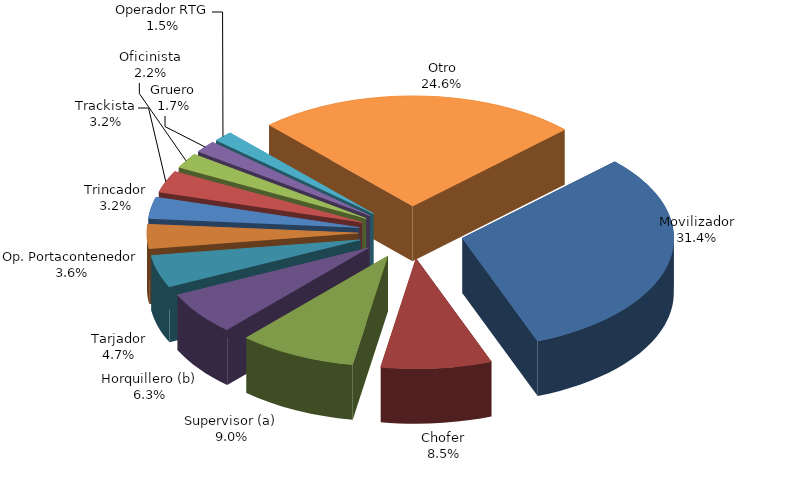
| Category | Series 0 |
|---|---|
| Movilizador | 502725 |
| Chofer | 135324 |
| Supervisor (a) | 144056 |
| Horquillero (b) | 100651 |
| Tarjador | 75884 |
| Op. Portacontenedor | 56864 |
| Trincador | 50632 |
| Trackista | 51581 |
| Oficinista | 35657 |
| Gruero | 27918 |
| Operador RTG | 23907 |
| Otro | 394177 |